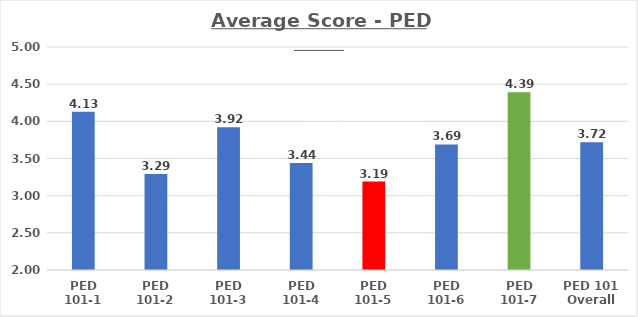
| Category | Average Score - PED 101s |
|---|---|
| PED 101-1 | 4.13 |
| PED 101-2 | 3.29 |
| PED 101-3 | 3.92 |
| PED 101-4 | 3.44 |
| PED 101-5 | 3.19 |
| PED 101-6 | 3.69 |
| PED 101-7 | 4.39 |
| PED 101 Overall | 3.72 |